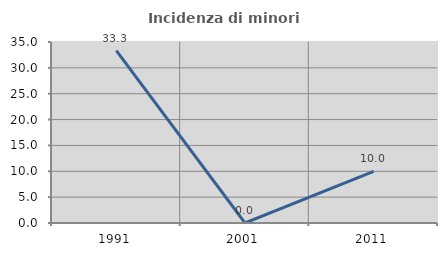
| Category | Incidenza di minori stranieri |
|---|---|
| 1991.0 | 33.333 |
| 2001.0 | 0 |
| 2011.0 | 10 |